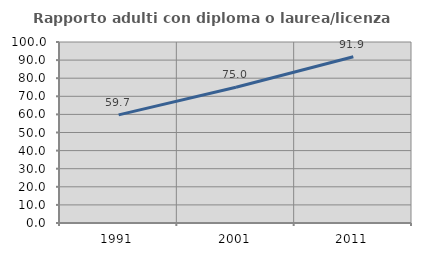
| Category | Rapporto adulti con diploma o laurea/licenza media  |
|---|---|
| 1991.0 | 59.74 |
| 2001.0 | 74.981 |
| 2011.0 | 91.879 |